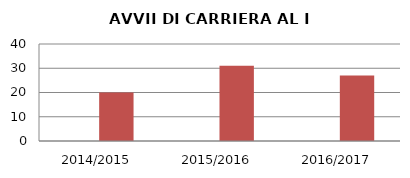
| Category | ANNO | NUMERO |
|---|---|---|
| 2014/2015 | 0 | 20 |
| 2015/2016 | 0 | 31 |
| 2016/2017 | 0 | 27 |